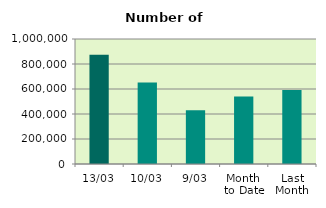
| Category | Series 0 |
|---|---|
| 13/03 | 874622 |
| 10/03 | 651588 |
| 9/03 | 430140 |
| Month 
to Date | 539892 |
| Last
Month | 592303 |